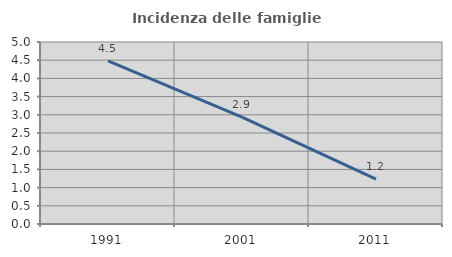
| Category | Incidenza delle famiglie numerose |
|---|---|
| 1991.0 | 4.484 |
| 2001.0 | 2.935 |
| 2011.0 | 1.235 |